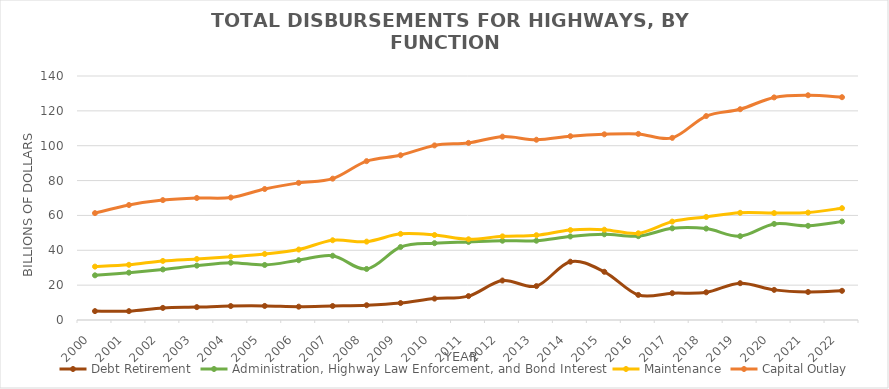
| Category | Debt | Administration, Highway Law | Maintenance | Capital Outlay |
|---|---|---|---|---|
| 2000.0 | 5.105 | 25.634 | 30.636 | 61.323 |
| 2001.0 | 5.086 | 27.17 | 31.677 | 65.968 |
| 2002.0 | 6.945 | 29.008 | 33.893 | 68.794 |
| 2003.0 | 7.393 | 31.198 | 35.011 | 70.004 |
| 2004.0 | 8.011 | 32.878 | 36.327 | 70.274 |
| 2005.0 | 8.071 | 31.584 | 37.882 | 75.162 |
| 2006.0 | 7.648 | 34.311 | 40.426 | 78.676 |
| 2007.0 | 8.032 | 36.864 | 45.759 | 81.098 |
| 2008.0 | 8.477 | 29.276 | 44.972 | 91.144 |
| 2009.0 | 9.734 | 41.887 | 49.432 | 94.525 |
| 2010.0 | 12.279 | 44.087 | 48.773 | 100.175 |
| 2011.0 | 13.713 | 44.804 | 46.311 | 101.612 |
| 2012.0 | 22.649 | 45.481 | 47.99 | 105.199 |
| 2013.0 | 19.459 | 45.493 | 48.655 | 103.426 |
| 2014.0 | 33.453 | 47.93 | 51.593 | 105.452 |
| 2015.0 | 27.658 | 49.181 | 51.817 | 106.539 |
| 2016.0 | 14.384 | 48.088 | 49.749 | 106.78 |
| 2017.0 | 15.383 | 52.616 | 56.466 | 104.512 |
| 2018.0 | 15.89 | 52.445 | 59.139 | 117.025 |
| 2019.0 | 21.123 | 48.088 | 61.503 | 120.934 |
| 2020.0 | 17.287 | 55.132 | 61.346 | 127.716 |
| 2021.0 | 16.081 | 54.04 | 61.622 | 128.95 |
| 2022.0 | 16.746 | 56.518 | 64.158 | 127.841 |